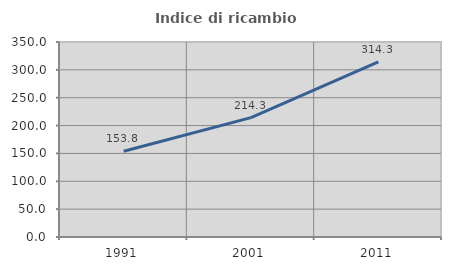
| Category | Indice di ricambio occupazionale  |
|---|---|
| 1991.0 | 153.846 |
| 2001.0 | 214.286 |
| 2011.0 | 314.286 |